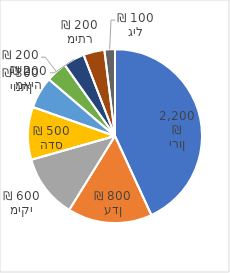
| Category | מכירות במאי 2020 |
|---|---|
| ירון | 2200 |
| עדן | 800 |
| מיקי | 600 |
| הדס | 500 |
| יונתן | 300 |
| נעם | 200 |
| מאיה | 200 |
| מיתר | 200 |
| גיל | 100 |